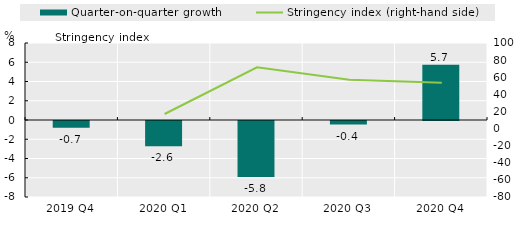
| Category | Quarter-on-quarter growth |
|---|---|
| 2019 Q4 | -0.711 |
| 2020 Q1 | -2.613 |
| 2020 Q2 | -5.814 |
| 2020 Q3 | -0.37 |
| 2020 Q4 | 5.743 |